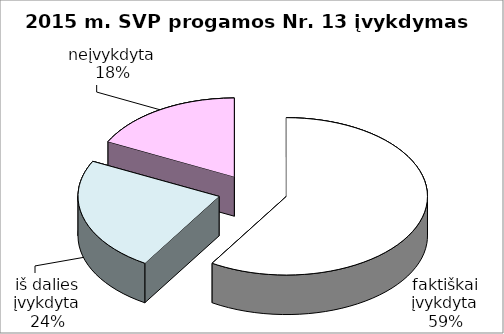
| Category | Series 0 |
|---|---|
| faktiškai įvykdyta | 10 |
| iš dalies įvykdyta | 4 |
| neįvykdyta | 3 |